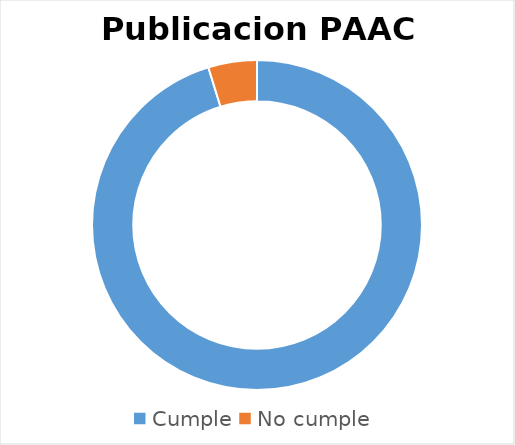
| Category | La entidad Publico en el portal web el PAAC 2020 |
|---|---|
| Cumple | 40 |
| No cumple | 2 |